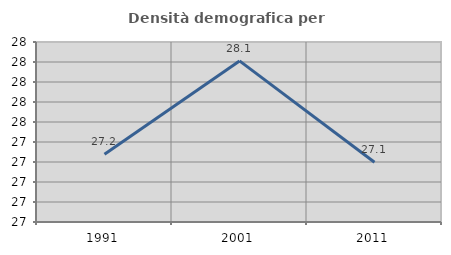
| Category | Densità demografica |
|---|---|
| 1991.0 | 27.177 |
| 2001.0 | 28.111 |
| 2011.0 | 27.097 |